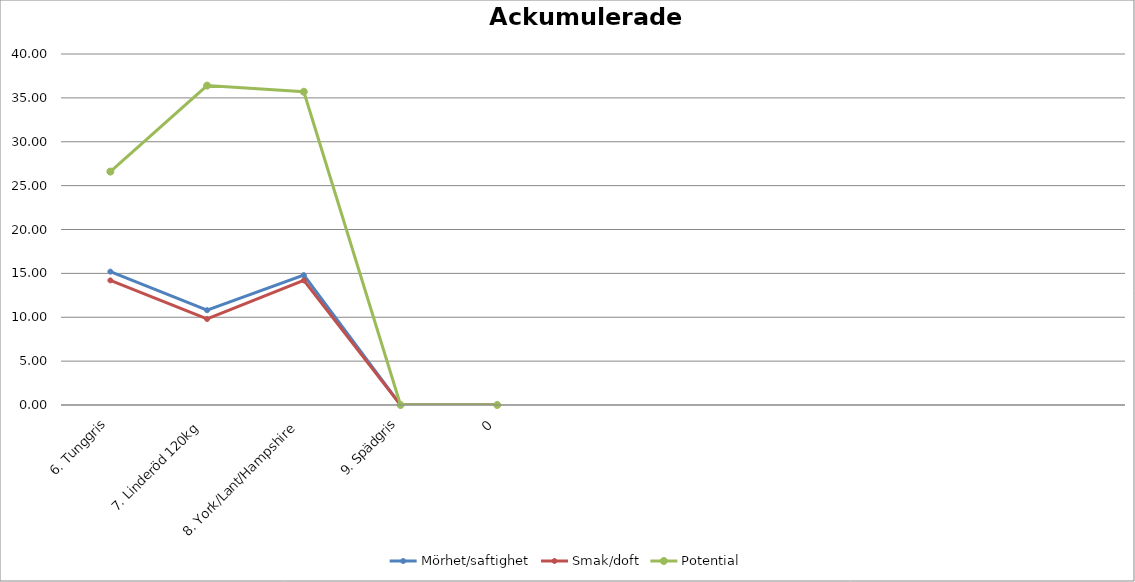
| Category | Mörhet/saftighet | Smak/doft | Potential |
|---|---|---|---|
| 6. Tunggris | 15.2 | 14.2 | 26.6 |
| 7. Linderöd 120kg | 10.8 | 9.8 | 36.4 |
| 8. York/Lant/Hampshire | 14.8 | 14.2 | 35.7 |
| 9. Spädgris | 0 | 0 | 0 |
| 0 | 0 | 0 | 0 |